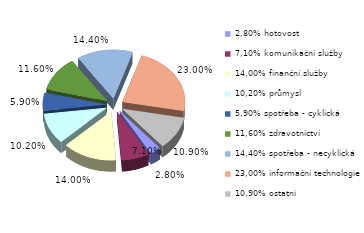
| Category | Series 0 |
|---|---|
| 2,80% hotovost | 0.028 |
| 7,10% komunikační služby | 0.071 |
| 14,00% finanční služby | 0.14 |
| 10,20% průmysl | 0.102 |
| 5,90% spotřeba - cyklická | 0.059 |
| 11,60% zdravotnictví | 0.116 |
| 14,40% spotřeba - necyklická | 0.144 |
| 23,00% informační technologie | 0.23 |
| 10,90% ostatní | 0.109 |